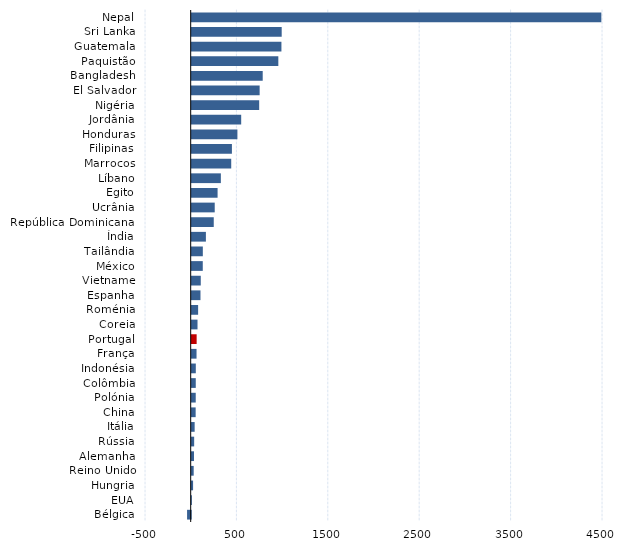
| Category | Series 2 |
|---|---|
| Nepal | 4481.796 |
| Sri Lanka | 984.668 |
| Guatemala | 981.692 |
| Paquistão | 947.791 |
| Bangladesh | 776.923 |
| El Salvador | 743.444 |
| Nigéria | 738.27 |
| Jordânia | 541.512 |
| Honduras | 500.112 |
| Filipinas | 439.915 |
| Marrocos | 432.452 |
| Líbano | 319.056 |
| Egito | 283.19 |
| Ucrânia | 251.912 |
| República Dominicana  | 241.253 |
| Índia | 155.321 |
| Tailândia | 121.749 |
| México | 121.122 |
| Vietname | 99.256 |
| Espanha | 96.098 |
| Roménia | 70.27 |
| Coreia | 63.628 |
| Portugal | 54.042 |
| França | 52.923 |
| Indonésia | 44.943 |
| Colômbia | 44.485 |
| Polónia | 44.093 |
| China | 43.265 |
| Itália | 32.317 |
| Rússia | 26.928 |
| Alemanha | 24.975 |
| Reino Unido | 21.737 |
| Hungria | 15.164 |
| EUA | 1.896 |
| Bélgica | -39.721 |